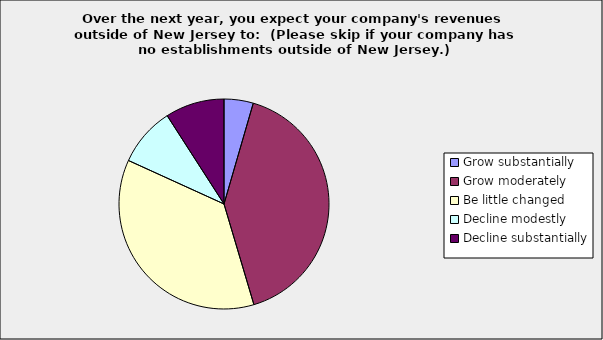
| Category | Series 0 |
|---|---|
| Grow substantially | 0.045 |
| Grow moderately | 0.409 |
| Be little changed | 0.364 |
| Decline modestly | 0.091 |
| Decline substantially | 0.091 |